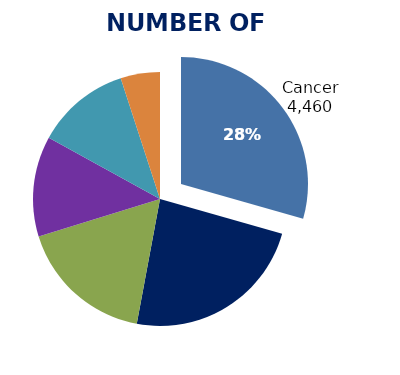
| Category | Cancer (C00-C97) |
|---|---|
| 0 | 4538 |
| 1 | 3629 |
| 2 | 2671 |
| 3 | 1973 |
| 4 | 1847 |
| 5 | 772 |